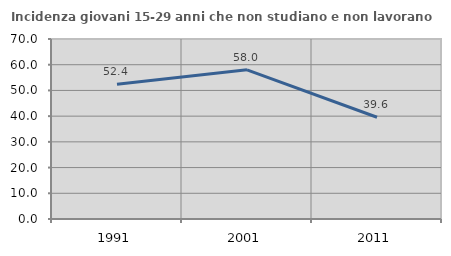
| Category | Incidenza giovani 15-29 anni che non studiano e non lavorano  |
|---|---|
| 1991.0 | 52.434 |
| 2001.0 | 58.02 |
| 2011.0 | 39.568 |